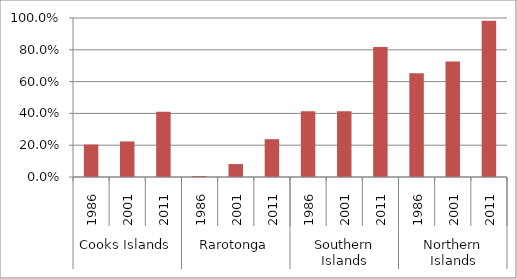
| Category | Private Rainwater Tank |
|---|---|
| 0 | 0.204 |
| 1 | 0.224 |
| 2 | 0.41 |
| 3 | 0.006 |
| 4 | 0.081 |
| 5 | 0.238 |
| 6 | 0.414 |
| 7 | 0.414 |
| 8 | 0.817 |
| 9 | 0.653 |
| 10 | 0.727 |
| 11 | 0.982 |